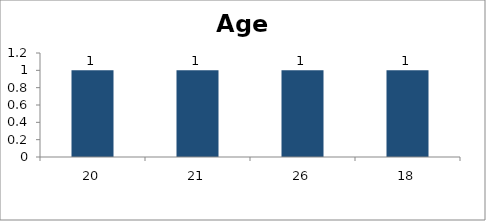
| Category | Age |
|---|---|
| 20.0 | 1 |
| 21.0 | 1 |
| 26.0 | 1 |
| 18.0 | 1 |